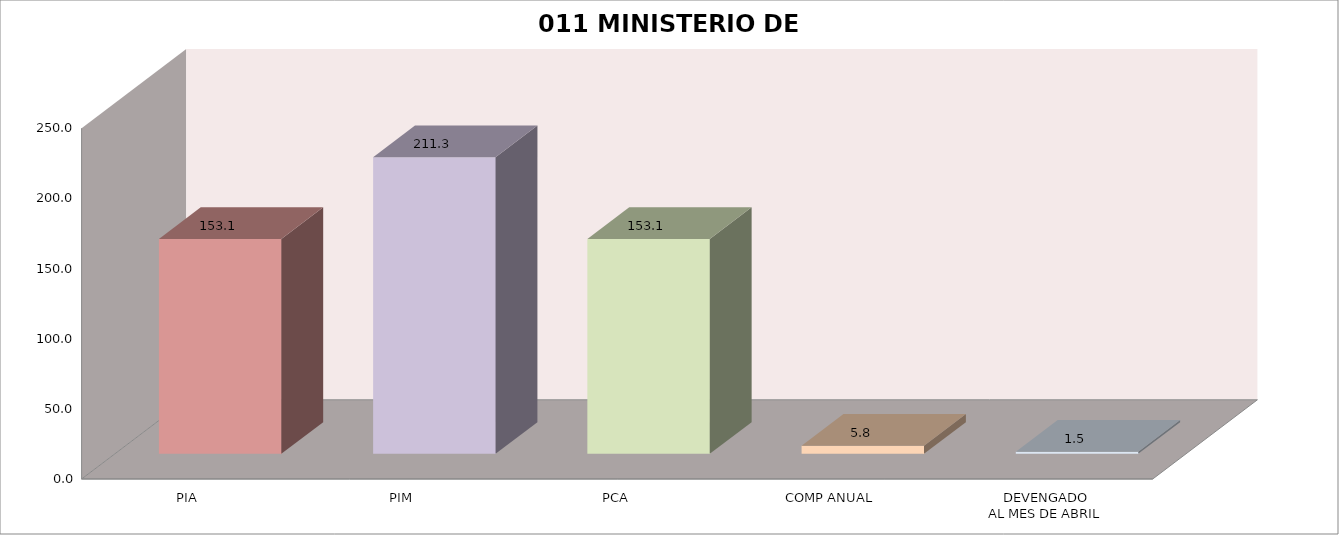
| Category | 011 MINISTERIO DE SALUD |
|---|---|
| PIA | 153.071 |
| PIM | 211.34 |
| PCA | 153.071 |
| COMP ANUAL | 5.752 |
| DEVENGADO
AL MES DE ABRIL | 1.518 |